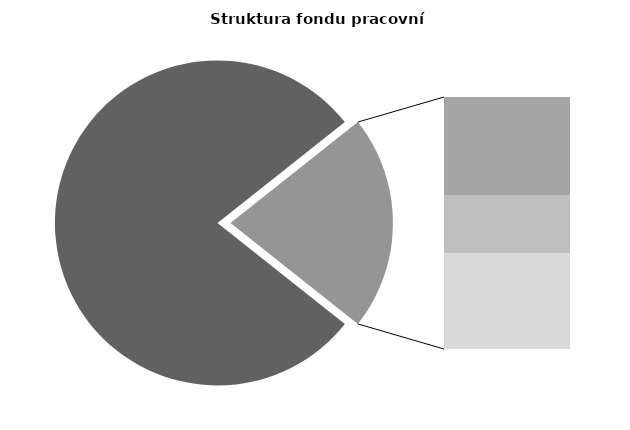
| Category | Series 0 |
|---|---|
| Průměrná měsíční odpracovaná doba bez přesčasu | 133.912 |
| Dovolená | 14.223 |
| Nemoc | 8.316 |
| Jiné | 13.775 |